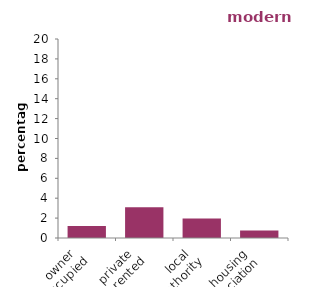
| Category | modern facilities |
|---|---|
| owner 
occupied | 1.216 |
| private 
rented | 3.087 |
| local 
authority | 1.97 |
| housing 
association | 0.747 |